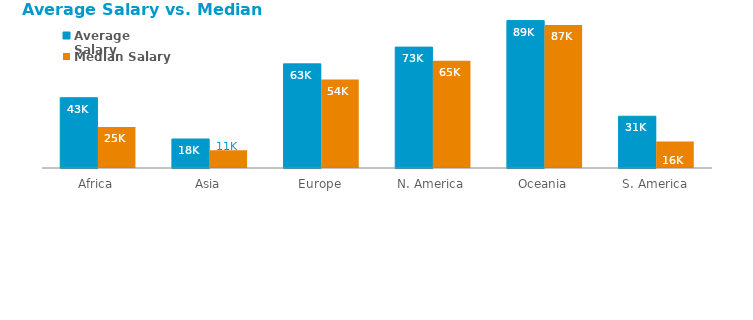
| Category | Average Salary | Median Salary |
|---|---|---|
| Africa | 42576.189 | 24864 |
| Asia | 17575.899 | 10685 |
| Europe | 63120.105 | 53591 |
| N. America | 73263.89 | 65000 |
| Oceania | 89331.49 | 86693 |
| S. America | 31366.455 | 16110 |